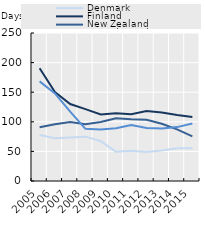
| Category | Denmark | Finland | New Zealand | United Kingdom |
|---|---|---|---|---|
| 2005.0 | 77.54 | 190.59 | 90.7 | 168.232 |
| 2006.0 | 72.07 | 150.197 | 95.7 | 148.056 |
| 2007.0 | 73.6 | 129.992 | 99.8 | 117.312 |
| 2008.0 | 74.92 | 121.416 | 95.8 | 88.07 |
| 2009.0 | 67.44 | 112.477 | 99.6 | 86.912 |
| 2010.0 | 49.27 | 114.552 | 106.1 | 89.044 |
| 2011.0 | 51.18 | 112.849 | 104.4 | 94.618 |
| 2012.0 | 48.86 | 118.271 | 103.6 | 89.622 |
| 2013.0 | 51.54 | 115.625 | 96.6 | 88.624 |
| 2014.0 | 55.24 | 111.411 | 87.3 | 91.015 |
| 2015.0 | 55.21 | 107.988 | 75.4 | 97.203 |